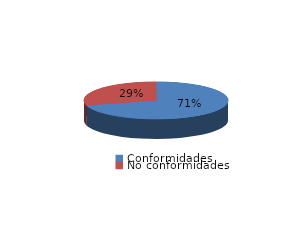
| Category | Series 0 |
|---|---|
| Conformidades | 2220 |
| No conformidades | 928 |